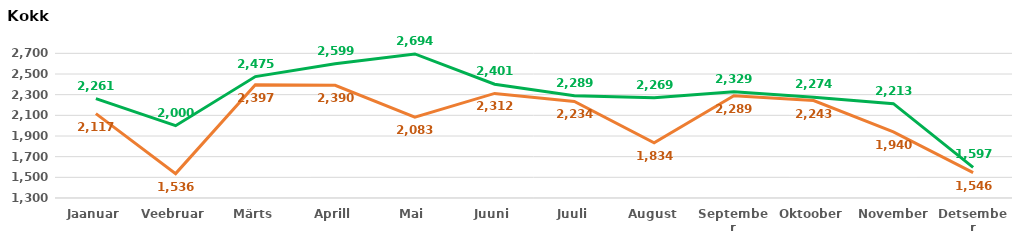
| Category | 2016 | 2015 |
|---|---|---|
| Jaanuar | 2261 | 2117 |
| Veebruar | 2000 | 1536 |
| Märts | 2475 | 2397 |
| Aprill | 2599 | 2390 |
| Mai | 2694 | 2083 |
| Juuni | 2401 | 2312 |
| Juuli | 2289 | 2234 |
| August | 2269 | 1834 |
| September | 2329 | 2289 |
| Oktoober | 2274 | 2243 |
| November | 2213 | 1940 |
| Detsember | 1597 | 1546 |